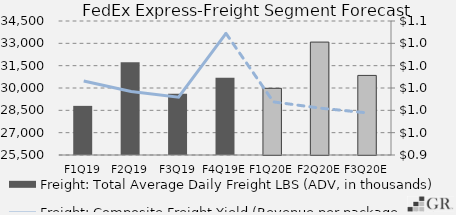
| Category | Freight: Total Average Daily Freight LBS (ADV, in thousands) |
|---|---|
|  F1Q19  | 28800 |
|  F2Q19  | 31733.7 |
|  F3Q19  | 29617 |
|  F4Q19E  | 30685.617 |
|  F1Q20E  | 29979.114 |
|  F2Q20E  | 33083.838 |
|  F3Q20E  | 30845.632 |